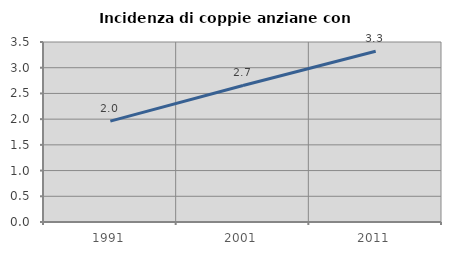
| Category | Incidenza di coppie anziane con figli |
|---|---|
| 1991.0 | 1.961 |
| 2001.0 | 2.655 |
| 2011.0 | 3.32 |